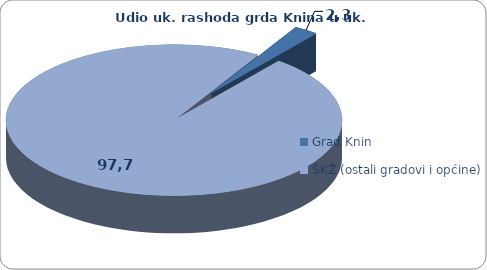
| Category | Series 0 | Series 1 |
|---|---|---|
| Grad Knin | 199262.117 | 2.325 |
| ŠKŽ (ostali gradovi i općine) | 8369450 | 97.675 |